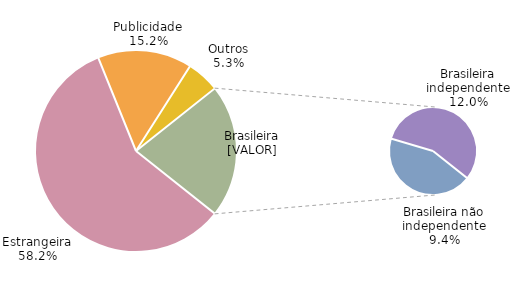
| Category | Series 0 |
|---|---|
| Estrangeira | 0.582 |
| Publicidade | 0.152 |
| Outros | 0.053 |
| Brasileira não independente | 0.094 |
| Brasileira independente | 0.12 |